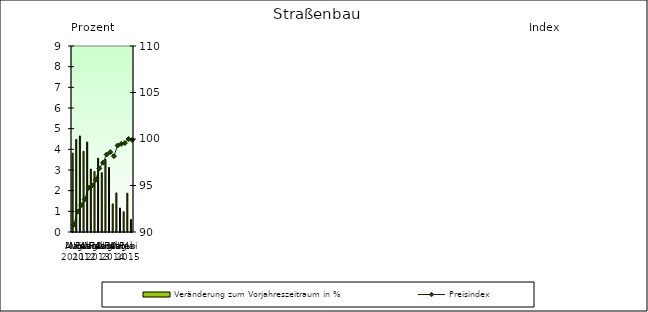
| Category | Veränderung zum Vorjahreszeitraum in % |
|---|---|
| 0 | 3.815 |
| 1 | 4.478 |
| 2 | 4.649 |
| 3 | 3.902 |
| 4 | 4.352 |
| 5 | 3.048 |
| 6 | 2.93 |
| 7 | 3.568 |
| 8 | 2.873 |
| 9 | 3.512 |
| 10 | 3.122 |
| 11 | 1.36 |
| 12 | 1.892 |
| 13 | 1.161 |
| 14 | 0.98 |
| 15 | 1.878 |
| 16 | 0.607 |